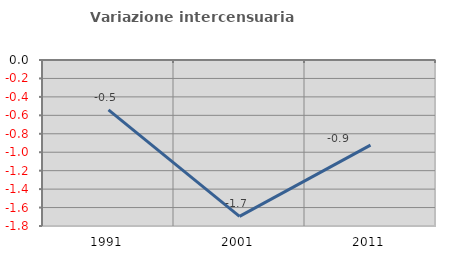
| Category | Variazione intercensuaria annua |
|---|---|
| 1991.0 | -0.541 |
| 2001.0 | -1.696 |
| 2011.0 | -0.924 |